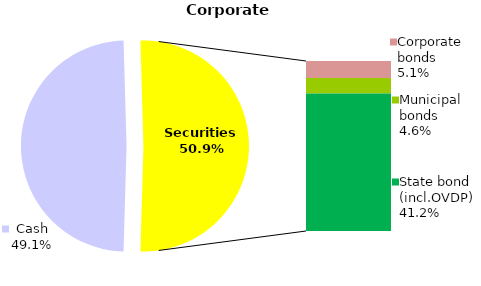
| Category | Corporate |
|---|---|
| Cash | 137.401 |
| Bank metals | 0 |
| Real estate | 0 |
| Other assets | 0 |
| Equities | 0.022 |
| Corporate bonds | 14.332 |
| Municipal bonds | 12.891 |
| State bond (incl.OVDP) | 115.253 |